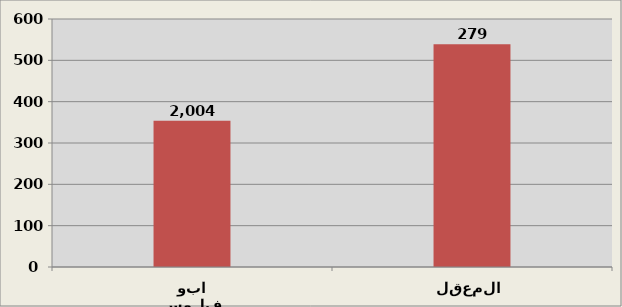
| Category | Series 0 |
|---|---|
| ابو فلوس | 354 |
| المعقل | 539 |